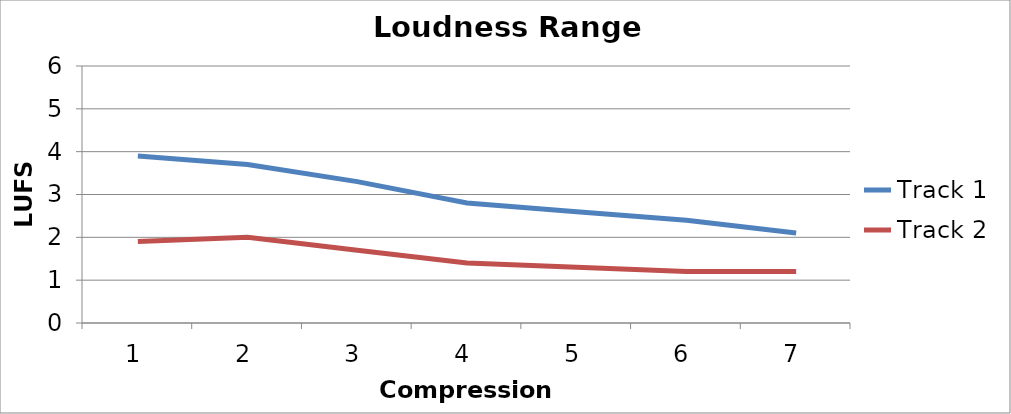
| Category | Track 1 | Track 2 |
|---|---|---|
| 0 | 3.9 | 1.9 |
| 1 | 3.7 | 2 |
| 2 | 3.3 | 1.7 |
| 3 | 2.8 | 1.4 |
| 4 | 2.6 | 1.3 |
| 5 | 2.4 | 1.2 |
| 6 | 2.1 | 1.2 |